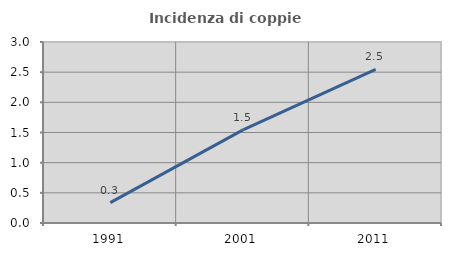
| Category | Incidenza di coppie miste |
|---|---|
| 1991.0 | 0.339 |
| 2001.0 | 1.544 |
| 2011.0 | 2.545 |